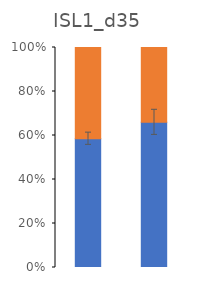
| Category | Series 0 | Series 1 |
|---|---|---|
| Chimpanzee | 60.308 | 42.738 |
| Human | 64.775 | 33.394 |